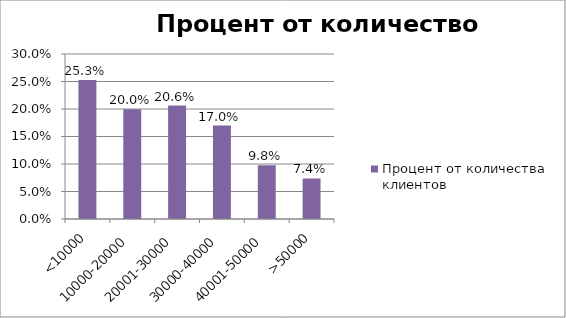
| Category | Процент от количества клиентов |
|---|---|
| <10000 | 0.253 |
| 10000-20000 | 0.2 |
| 20001-30000 | 0.206 |
| 30000-40000 | 0.17 |
| 40001-50000 | 0.098 |
| >50000 | 0.074 |